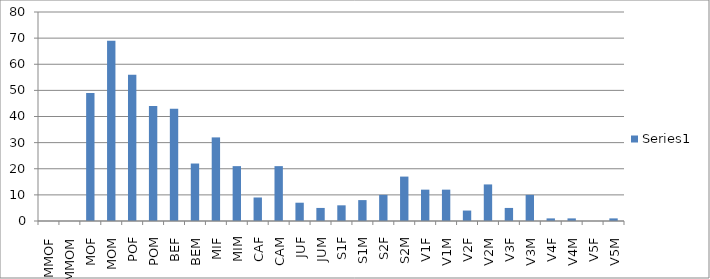
| Category | Series 0 |
|---|---|
| MMOF | 0 |
| MMOM | 0 |
| MOF | 49 |
| MOM | 69 |
| POF | 56 |
| POM | 44 |
| BEF | 43 |
| BEM | 22 |
| MIF | 32 |
| MIM | 21 |
| CAF | 9 |
| CAM | 21 |
| JUF | 7 |
| JUM | 5 |
| S1F | 6 |
| S1M | 8 |
| S2F | 10 |
| S2M | 17 |
| V1F | 12 |
| V1M | 12 |
| V2F | 4 |
| V2M | 14 |
| V3F | 5 |
| V3M | 10 |
| V4F | 1 |
| V4M | 1 |
| V5F | 0 |
| V5M | 1 |